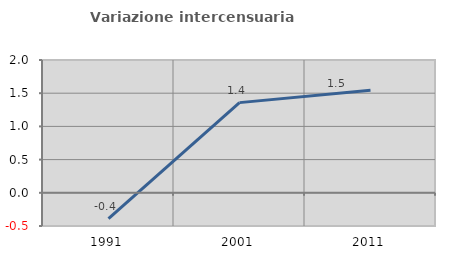
| Category | Variazione intercensuaria annua |
|---|---|
| 1991.0 | -0.389 |
| 2001.0 | 1.358 |
| 2011.0 | 1.544 |